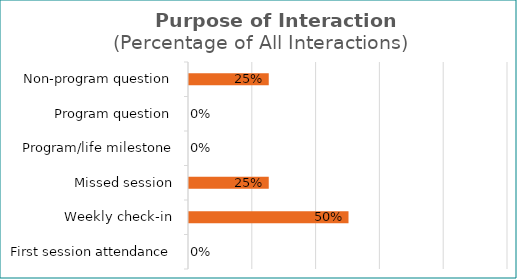
| Category | Series 0 |
|---|---|
| First session attendance | 0 |
| Weekly check-in | 0.5 |
| Missed session | 0.25 |
| Program/life milestone | 0 |
| Program question | 0 |
| Non-program question | 0.25 |